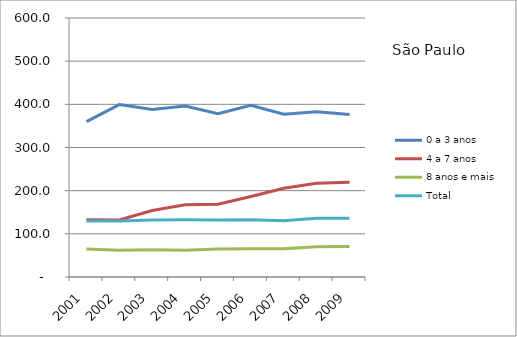
| Category | 0 a 3 anos | 4 a 7 anos | 8 anos e mais | Total |
|---|---|---|---|---|
| 2001.0 | 359.8 | 132.8 | 64.7 | 130 |
| 2002.0 | 399.3 | 132 | 61.8 | 129.6 |
| 2003.0 | 388 | 154.2 | 63.3 | 132.3 |
| 2004.0 | 395.9 | 167.2 | 61.8 | 132.4 |
| 2005.0 | 378.3 | 168.4 | 65.1 | 131.8 |
| 2006.0 | 397.8 | 186.3 | 65.5 | 132.5 |
| 2007.0 | 377 | 205.5 | 65.5 | 130.5 |
| 2008.0 | 383 | 217.2 | 69.8 | 136.2 |
| 2009.0 | 376.4 | 219.3 | 70.9 | 136.1 |